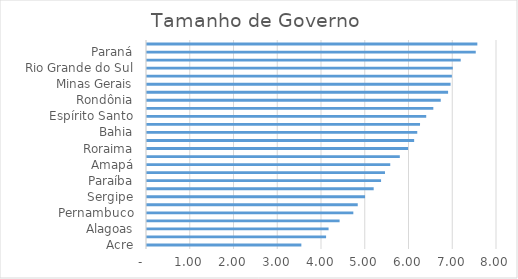
| Category | Dimensão  1 |
|---|---|
| Acre | 3.528 |
| Piauí | 4.093 |
| Alagoas | 4.15 |
| Amazonas | 4.402 |
| Pernambuco | 4.716 |
| Tocantins | 4.817 |
| Sergipe | 4.984 |
| Maranhão | 5.181 |
| Paraíba | 5.35 |
| Rio Grande do Norte | 5.44 |
| Amapá | 5.56 |
| Pará | 5.779 |
| Roraima | 5.967 |
| Mato Grosso do Sul | 6.106 |
| Bahia | 6.177 |
| Ceará | 6.241 |
| Espírito Santo | 6.382 |
| Mato Grosso | 6.545 |
| Rondônia | 6.714 |
| Rio de Janeiro | 6.882 |
| Minas Gerais | 6.939 |
| Goiás | 6.969 |
| Rio Grande do Sul | 6.99 |
| São Paulo | 7.171 |
| Paraná | 7.514 |
| Santa Catarina | 7.551 |